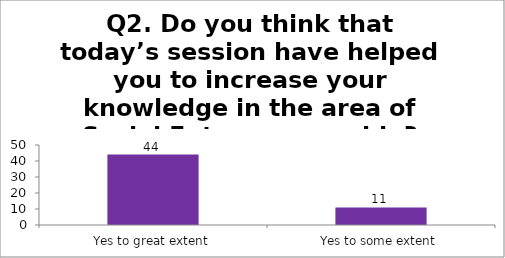
| Category | Q2. Do you think that today’s session have helped you to increase your knowledge in the area of Social Entrepreneurship? |
|---|---|
| Yes to great extent | 44 |
| Yes to some extent | 11 |